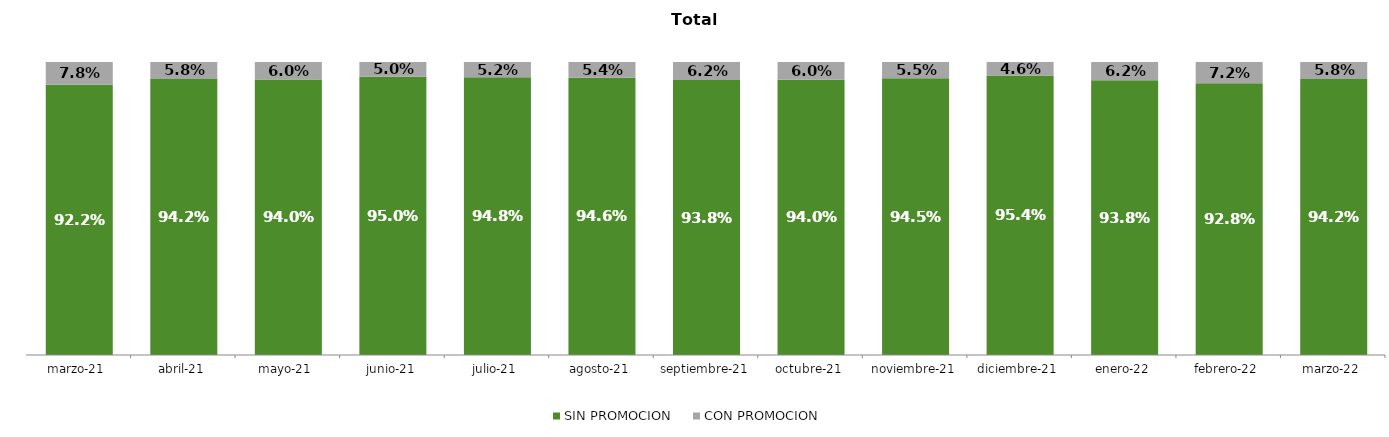
| Category | SIN PROMOCION   | CON PROMOCION   |
|---|---|---|
| 2021-03-01 | 0.922 | 0.078 |
| 2021-04-01 | 0.942 | 0.058 |
| 2021-05-01 | 0.94 | 0.06 |
| 2021-06-01 | 0.95 | 0.05 |
| 2021-07-01 | 0.948 | 0.052 |
| 2021-08-01 | 0.946 | 0.054 |
| 2021-09-01 | 0.938 | 0.062 |
| 2021-10-01 | 0.94 | 0.06 |
| 2021-11-01 | 0.945 | 0.055 |
| 2021-12-01 | 0.954 | 0.046 |
| 2022-01-01 | 0.938 | 0.062 |
| 2022-02-01 | 0.928 | 0.072 |
| 2022-03-01 | 0.942 | 0.058 |